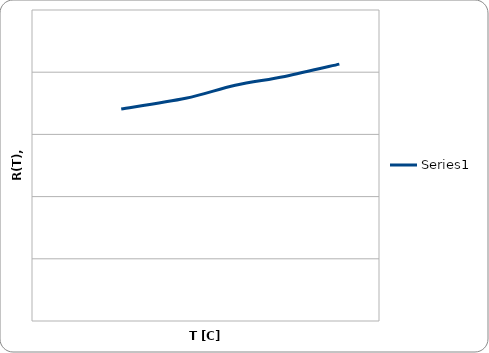
| Category | Series 0 |
|---|---|
| 18.0 | 17.05 |
| 31.0 | 17.9 |
| 41.0 | 18.95 |
| 51.0 | 19.66 |
| 62.0 | 20.65 |